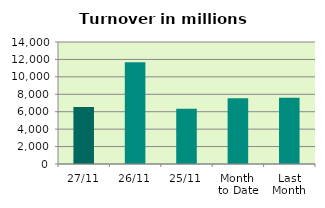
| Category | Series 0 |
|---|---|
| 27/11 | 6553.754 |
| 26/11 | 11670.742 |
| 25/11 | 6348.343 |
| Month 
to Date | 7548.184 |
| Last
Month | 7601.18 |